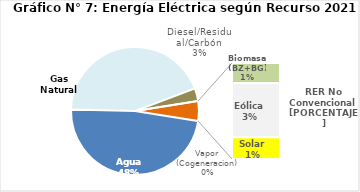
| Category | Series 0 |
|---|---|
| Agua | 2259.647 |
| Gas Natural | 2074.889 |
| Diesel/Residual/Carbón | 151.737 |
| Vapor (Cogeneracion) | 0.217 |
| Biomasa (BZ+BG) | 49.721 |
| Eólica | 134.189 |
| Solar | 54.263 |